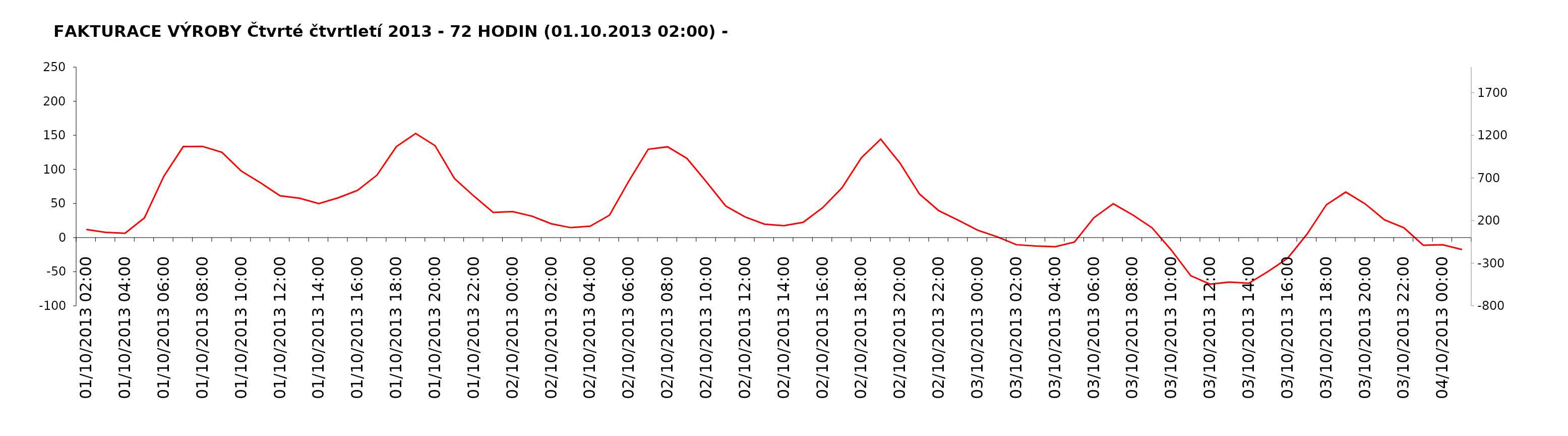
| Category | měření [MWh] |
|---|---|
| 01/10/2013 | 0 |
| 01/10/2013 | 0 |
| 01/10/2013 | 0 |
| 01/10/2013 | 0 |
| 01/10/2013 | 0 |
| 01/10/2013 | 0 |
| 01/10/2013 | 0 |
| 01/10/2013 | 0 |
| 01/10/2013 | 0 |
| 01/10/2013 | 0 |
| 01/10/2013 | 0 |
| 01/10/2013 | 0 |
| 01/10/2013 | 0 |
| 01/10/2013 | 0 |
| 01/10/2013 | 0 |
| 01/10/2013 | 0 |
| 01/10/2013 | 0 |
| 01/10/2013 | 0 |
| 01/10/2013 | 0 |
| 01/10/2013 | 0 |
| 01/10/2013 | 0 |
| 01/10/2013 | 0 |
| 02/10/2013 | 0 |
| 02/10/2013 | 0 |
| 02/10/2013 | 0 |
| 02/10/2013 | 0 |
| 02/10/2013 | 0 |
| 02/10/2013 | 0 |
| 02/10/2013 | 0 |
| 02/10/2013 | 0 |
| 02/10/2013 | 0 |
| 02/10/2013 | 0 |
| 02/10/2013 | 0 |
| 02/10/2013 | 0 |
| 02/10/2013 | 0 |
| 02/10/2013 | 0 |
| 02/10/2013 | 0 |
| 02/10/2013 | 0 |
| 02/10/2013 | 0 |
| 02/10/2013 | 0 |
| 02/10/2013 | 0 |
| 02/10/2013 | 0 |
| 02/10/2013 | 0 |
| 02/10/2013 | 0 |
| 02/10/2013 | 0 |
| 02/10/2013 | 0 |
| 03/10/2013 | 0 |
| 03/10/2013 | 0 |
| 03/10/2013 | 0 |
| 03/10/2013 | 0 |
| 03/10/2013 | 0 |
| 03/10/2013 | 0 |
| 03/10/2013 | 0 |
| 03/10/2013 | 0 |
| 03/10/2013 | 0 |
| 03/10/2013 | 0 |
| 03/10/2013 | 0 |
| 03/10/2013 | 0 |
| 03/10/2013 | 0 |
| 03/10/2013 | 0 |
| 03/10/2013 | 0 |
| 03/10/2013 | 0 |
| 03/10/2013 | 0 |
| 03/10/2013 | 0 |
| 03/10/2013 | 0 |
| 03/10/2013 | 0 |
| 03/10/2013 | 0 |
| 03/10/2013 | 0 |
| 03/10/2013 | 0 |
| 03/10/2013 | 0 |
| 04/10/2013 | 0 |
| 04/10/2013 | 0 |